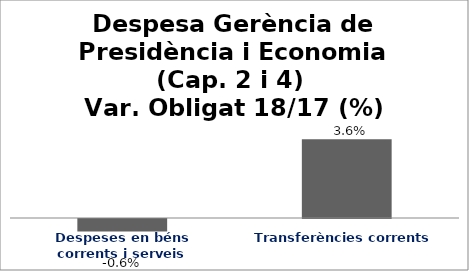
| Category | Series 0 |
|---|---|
| Despeses en béns corrents i serveis | -0.006 |
| Transferències corrents | 0.036 |